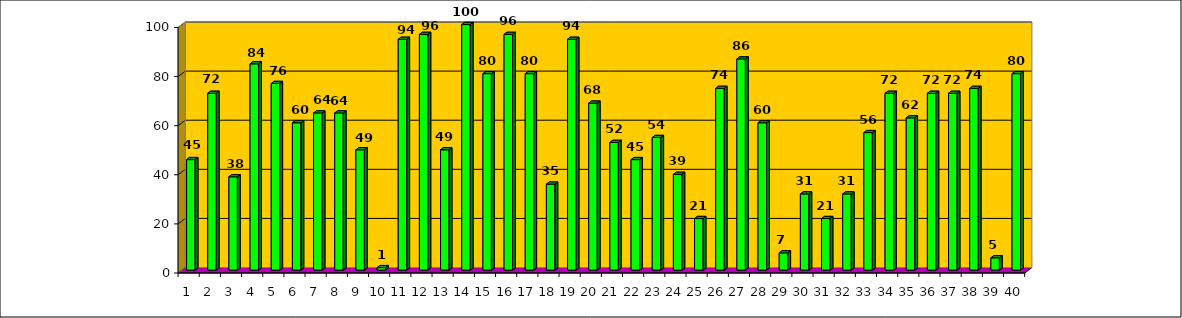
| Category | Series 0 |
|---|---|
| 0 | 45 |
| 1 | 72 |
| 2 | 38 |
| 3 | 84 |
| 4 | 76 |
| 5 | 60 |
| 6 | 64 |
| 7 | 64 |
| 8 | 49 |
| 9 | 1 |
| 10 | 94 |
| 11 | 96 |
| 12 | 49 |
| 13 | 100 |
| 14 | 80 |
| 15 | 96 |
| 16 | 80 |
| 17 | 35 |
| 18 | 94 |
| 19 | 68 |
| 20 | 52 |
| 21 | 45 |
| 22 | 54 |
| 23 | 39 |
| 24 | 21 |
| 25 | 74 |
| 26 | 86 |
| 27 | 60 |
| 28 | 7 |
| 29 | 31 |
| 30 | 21 |
| 31 | 31 |
| 32 | 56 |
| 33 | 72 |
| 34 | 62 |
| 35 | 72 |
| 36 | 72 |
| 37 | 74 |
| 38 | 5 |
| 39 | 80 |